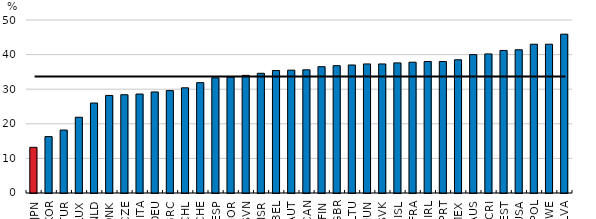
| Category | Country |
|---|---|
| JPN | 13.2 |
| KOR | 16.3 |
| TUR | 18.2 |
| LUX | 21.9 |
| NLD | 26 |
| DNK | 28.2 |
| CZE | 28.4 |
| ITA | 28.6 |
| DEU | 29.2 |
| GRC | 29.6 |
| CHL | 30.4 |
| CHE | 31.9 |
| ESP | 33.3 |
| NOR | 33.5 |
| SVN | 34 |
| ISR | 34.6 |
| BEL | 35.4 |
| AUT | 35.5 |
| CAN | 35.6 |
| FIN | 36.5 |
| GBR | 36.8 |
| LTU | 37 |
| HUN | 37.3 |
| SVK | 37.3 |
| ISL | 37.6 |
| FRA | 37.8 |
| IRL | 38 |
| PRT | 38 |
| MEX | 38.5 |
| AUS | 40 |
| CRI | 40.2 |
| EST | 41.2 |
| USA | 41.4 |
| POL | 43 |
| SWE | 43 |
| LVA | 45.9 |